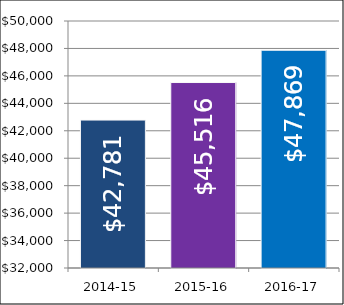
| Category | Series 0 |
|---|---|
| 2014-15 | 42781 |
| 2015-16 | 45516 |
| 2016-17 | 47869 |